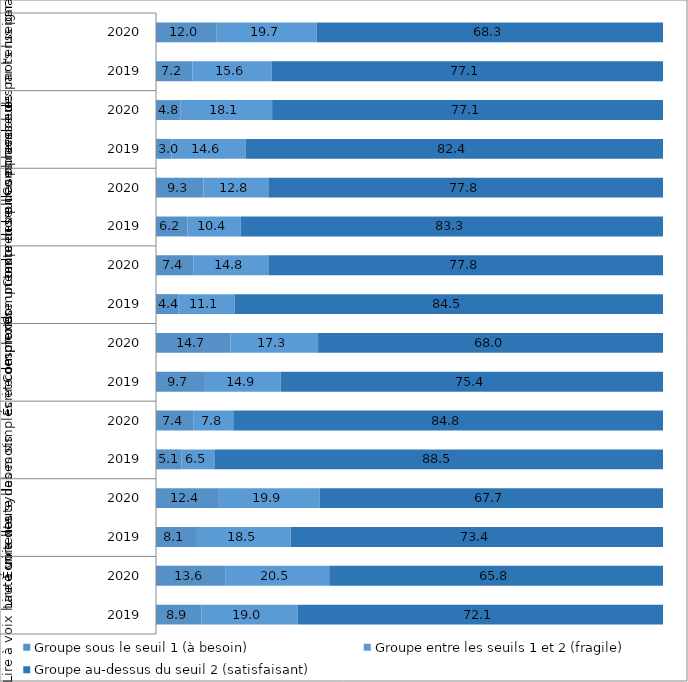
| Category | Groupe sous le seuil 1 (à besoin) | Groupe entre les seuils 1 et 2 (fragile) | Groupe au-dessus du seuil 2 (satisfaisant) |
|---|---|---|---|
| 0 | 8.948 | 18.972 | 72.081 |
| 1 | 13.642 | 20.528 | 65.83 |
| 2 | 8.08 | 18.511 | 73.409 |
| 3 | 12.402 | 19.864 | 67.738 |
| 4 | 5.059 | 6.454 | 88.487 |
| 5 | 7.446 | 7.798 | 84.752 |
| 6 | 9.653 | 14.916 | 75.431 |
| 7 | 14.706 | 17.264 | 68.03 |
| 8 | 4.385 | 11.095 | 84.519 |
| 9 | 7.36 | 14.808 | 77.832 |
| 10 | 6.243 | 10.431 | 83.326 |
| 11 | 9.342 | 12.82 | 77.84 |
| 12 | 3.041 | 14.605 | 82.354 |
| 13 | 4.784 | 18.12 | 77.096 |
| 14 | 7.207 | 15.644 | 77.149 |
| 15 | 11.972 | 19.742 | 68.282 |